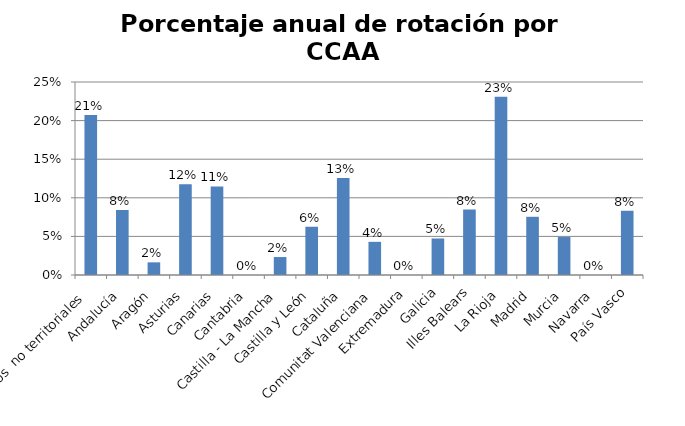
| Category | Porcentaje |
|---|---|
| Órganos  no territoriales | 0.207 |
| Andalucía | 0.084 |
| Aragón | 0.016 |
| Asturias | 0.118 |
| Canarias | 0.115 |
| Cantabria | 0 |
| Castilla - La Mancha | 0.023 |
| Castilla y León | 0.062 |
| Cataluña | 0.126 |
| Comunitat Valenciana | 0.043 |
| Extremadura | 0 |
| Galicia | 0.047 |
| Illes Balears | 0.085 |
| La Rioja | 0.231 |
| Madrid | 0.075 |
| Murcia | 0.049 |
| Navarra | 0 |
| País Vasco | 0.083 |